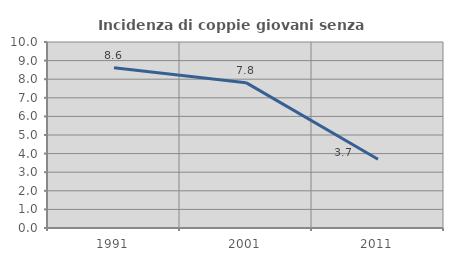
| Category | Incidenza di coppie giovani senza figli |
|---|---|
| 1991.0 | 8.611 |
| 2001.0 | 7.814 |
| 2011.0 | 3.692 |